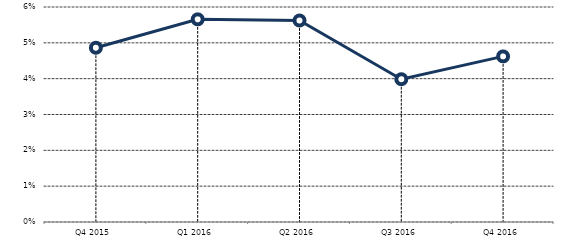
| Category | Series 0 |
|---|---|
| Q4 2015 | 0.049 |
| Q1 2016 | 0.057 |
| Q2 2016 | 0.056 |
| Q3 2016 | 0.04 |
| Q4 2016 | 0.046 |